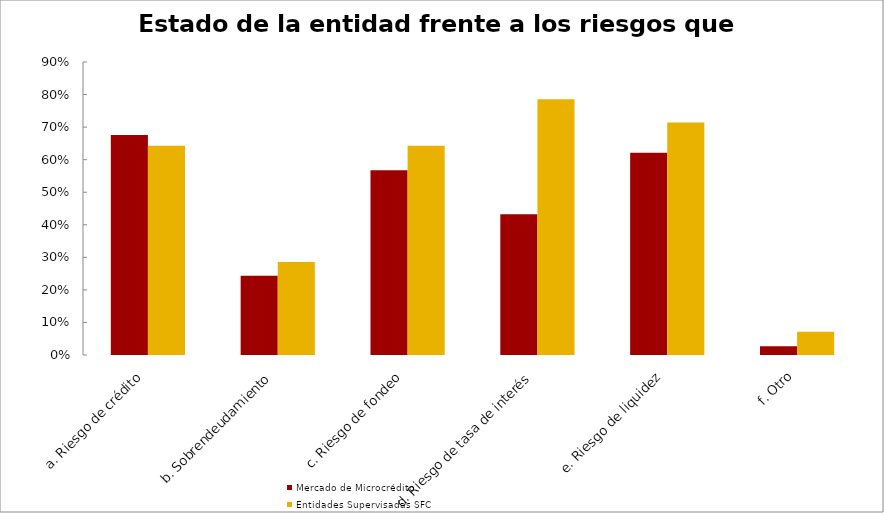
| Category | Mercado de Microcrédito | Entidades Supervisadas SFC |
|---|---|---|
| a. Riesgo de crédito | 0.676 | 0.643 |
| b. Sobrendeudamiento | 0.243 | 0.286 |
| c. Riesgo de fondeo | 0.568 | 0.643 |
| d. Riesgo de tasa de interés | 0.432 | 0.786 |
| e. Riesgo de liquidez | 0.622 | 0.714 |
| f. Otro | 0.027 | 0.071 |